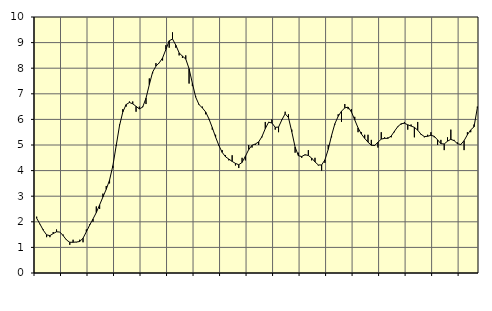
| Category | Piggar | Series 1 |
|---|---|---|
| nan | 2.2 | 2.14 |
| 87.0 | 1.9 | 1.91 |
| 87.0 | 1.7 | 1.67 |
| 87.0 | 1.4 | 1.49 |
| nan | 1.4 | 1.46 |
| 88.0 | 1.6 | 1.54 |
| 88.0 | 1.7 | 1.61 |
| 88.0 | 1.6 | 1.6 |
| nan | 1.5 | 1.46 |
| 89.0 | 1.3 | 1.29 |
| 89.0 | 1.1 | 1.2 |
| 89.0 | 1.3 | 1.2 |
| nan | 1.2 | 1.21 |
| 90.0 | 1.3 | 1.23 |
| 90.0 | 1.2 | 1.36 |
| 90.0 | 1.7 | 1.61 |
| nan | 1.9 | 1.87 |
| 91.0 | 2 | 2.11 |
| 91.0 | 2.6 | 2.36 |
| 91.0 | 2.5 | 2.66 |
| nan | 3.1 | 2.97 |
| 92.0 | 3.4 | 3.27 |
| 92.0 | 3.5 | 3.63 |
| 92.0 | 4.1 | 4.19 |
| nan | 5 | 4.97 |
| 93.0 | 5.8 | 5.75 |
| 93.0 | 6.4 | 6.29 |
| 93.0 | 6.5 | 6.58 |
| nan | 6.7 | 6.66 |
| 94.0 | 6.7 | 6.61 |
| 94.0 | 6.3 | 6.51 |
| 94.0 | 6.5 | 6.41 |
| nan | 6.5 | 6.48 |
| 95.0 | 6.6 | 6.83 |
| 95.0 | 7.6 | 7.36 |
| 95.0 | 7.8 | 7.85 |
| nan | 8.2 | 8.08 |
| 96.0 | 8.2 | 8.21 |
| 96.0 | 8.3 | 8.4 |
| 96.0 | 8.9 | 8.73 |
| nan | 8.8 | 9.07 |
| 97.0 | 9.4 | 9.14 |
| 97.0 | 8.8 | 8.9 |
| 97.0 | 8.5 | 8.6 |
| nan | 8.4 | 8.47 |
| 98.0 | 8.5 | 8.36 |
| 98.0 | 7.4 | 7.98 |
| 98.0 | 7.3 | 7.41 |
| nan | 6.9 | 6.87 |
| 99.0 | 6.6 | 6.58 |
| 99.0 | 6.5 | 6.45 |
| 99.0 | 6.2 | 6.29 |
| nan | 6 | 6.02 |
| 0.0 | 5.6 | 5.68 |
| 0.0 | 5.4 | 5.31 |
| 0.0 | 5 | 4.98 |
| nan | 4.8 | 4.71 |
| 1.0 | 4.6 | 4.54 |
| 1.0 | 4.4 | 4.45 |
| 1.0 | 4.6 | 4.36 |
| nan | 4.2 | 4.28 |
| 2.0 | 4.1 | 4.23 |
| 2.0 | 4.5 | 4.32 |
| 2.0 | 4.4 | 4.56 |
| nan | 5 | 4.82 |
| 3.0 | 4.9 | 4.99 |
| 3.0 | 5 | 5.04 |
| 3.0 | 5 | 5.12 |
| nan | 5.3 | 5.33 |
| 4.0 | 5.9 | 5.64 |
| 4.0 | 5.9 | 5.89 |
| 4.0 | 6 | 5.86 |
| nan | 5.6 | 5.69 |
| 5.0 | 5.5 | 5.7 |
| 5.0 | 6 | 5.98 |
| 5.0 | 6.3 | 6.22 |
| nan | 6.2 | 6.07 |
| 6.0 | 5.6 | 5.52 |
| 6.0 | 4.7 | 4.92 |
| 6.0 | 4.7 | 4.58 |
| nan | 4.5 | 4.55 |
| 7.0 | 4.6 | 4.62 |
| 7.0 | 4.8 | 4.59 |
| 7.0 | 4.4 | 4.49 |
| nan | 4.5 | 4.34 |
| 8.0 | 4.2 | 4.22 |
| 8.0 | 4 | 4.22 |
| 8.0 | 4.3 | 4.42 |
| nan | 5 | 4.83 |
| 9.0 | 5.3 | 5.37 |
| 9.0 | 5.8 | 5.83 |
| 9.0 | 6.2 | 6.12 |
| nan | 5.9 | 6.32 |
| 10.0 | 6.6 | 6.45 |
| 10.0 | 6.4 | 6.48 |
| 10.0 | 6.4 | 6.29 |
| nan | 6.1 | 5.98 |
| 11.0 | 5.5 | 5.67 |
| 11.0 | 5.5 | 5.43 |
| 11.0 | 5.4 | 5.26 |
| nan | 5.4 | 5.11 |
| 12.0 | 5.2 | 4.99 |
| 12.0 | 5 | 4.98 |
| 12.0 | 4.9 | 5.11 |
| nan | 5.5 | 5.23 |
| 13.0 | 5.3 | 5.26 |
| 13.0 | 5.3 | 5.26 |
| 13.0 | 5.3 | 5.35 |
| nan | 5.5 | 5.54 |
| 14.0 | 5.7 | 5.72 |
| 14.0 | 5.8 | 5.83 |
| 14.0 | 5.9 | 5.85 |
| nan | 5.6 | 5.79 |
| 15.0 | 5.8 | 5.74 |
| 15.0 | 5.3 | 5.69 |
| 15.0 | 5.9 | 5.58 |
| nan | 5.4 | 5.42 |
| 16.0 | 5.3 | 5.33 |
| 16.0 | 5.4 | 5.34 |
| 16.0 | 5.5 | 5.38 |
| nan | 5.3 | 5.34 |
| 17.0 | 5 | 5.2 |
| 17.0 | 5.2 | 5.05 |
| 17.0 | 4.8 | 5.04 |
| nan | 5.3 | 5.15 |
| 18.0 | 5.6 | 5.22 |
| 18.0 | 5.2 | 5.17 |
| 18.0 | 5.1 | 5.05 |
| nan | 5 | 5.02 |
| 19.0 | 4.8 | 5.17 |
| 19.0 | 5.5 | 5.4 |
| 19.0 | 5.5 | 5.59 |
| nan | 5.8 | 5.71 |
| 20.0 | 6.5 | 6.45 |